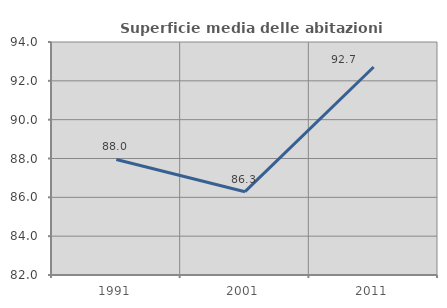
| Category | Superficie media delle abitazioni occupate |
|---|---|
| 1991.0 | 87.951 |
| 2001.0 | 86.291 |
| 2011.0 | 92.71 |